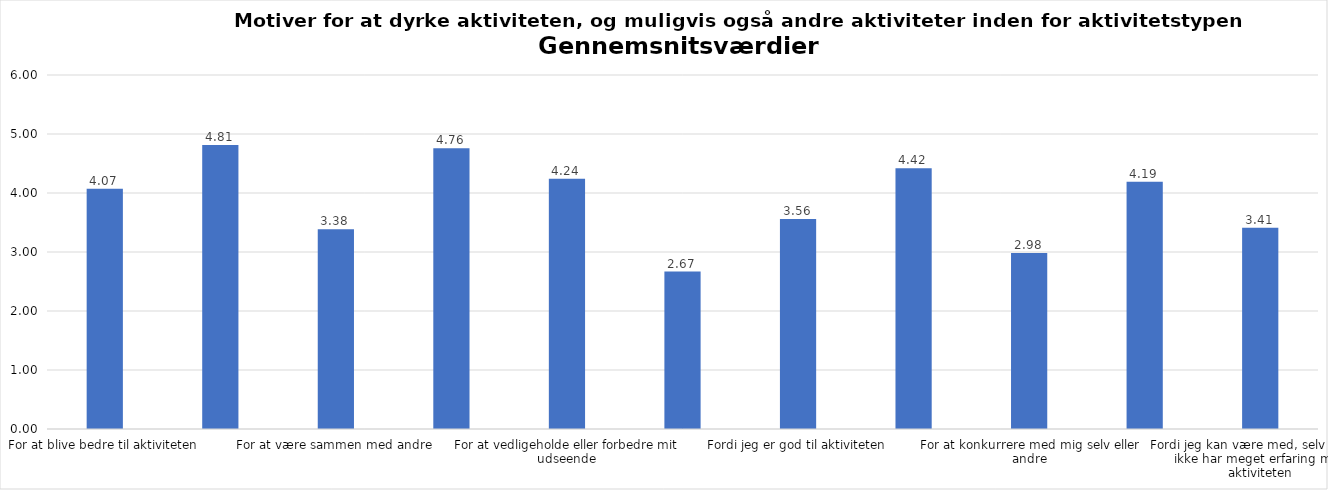
| Category | Gennemsnit |
|---|---|
| For at blive bedre til aktiviteten | 4.073 |
| For at vedligeholde eller forbedre min sundhed (fx helbred, fysisk form) | 4.813 |
| For at være sammen med andre | 3.385 |
| For at gøre noget godt for mig selv | 4.759 |
| For at vedligeholde eller forbedre mit udseende | 4.243 |
| Fordi andre i min omgangskreds opmuntrer mig til det | 2.667 |
| Fordi jeg er god til aktiviteten | 3.56 |
| Fordi jeg godt kan lide aktiviteten | 4.419 |
| For at konkurrere med mig selv eller andre | 2.985 |
| Fordi aktiviteten passer godt ind i min hverdag | 4.19 |
| Fordi jeg kan være med, selv om jeg ikke har meget erfaring med aktiviteten | 3.41 |